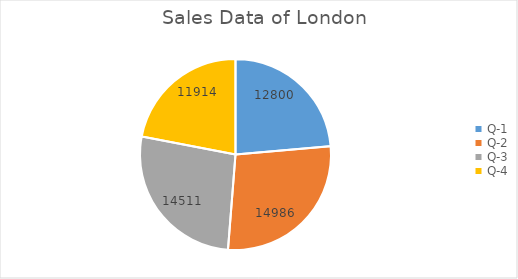
| Category | London |
|---|---|
| Q-1 | 12800 |
| Q-2 | 14986 |
| Q-3 | 14511 |
| Q-4 | 11914 |